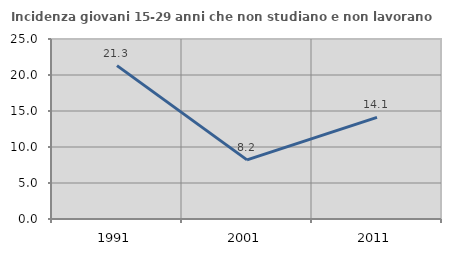
| Category | Incidenza giovani 15-29 anni che non studiano e non lavorano  |
|---|---|
| 1991.0 | 21.302 |
| 2001.0 | 8.212 |
| 2011.0 | 14.108 |